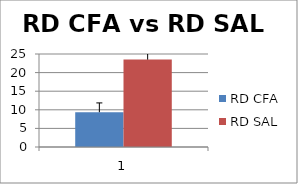
| Category | RD CFA | RD SAL |
|---|---|---|
| 0 | 9.351 | 23.494 |